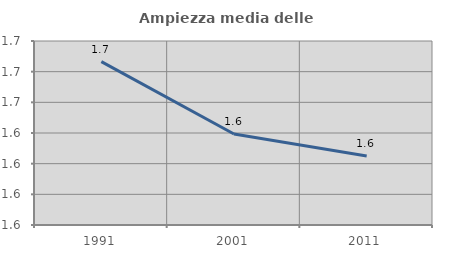
| Category | Ampiezza media delle famiglie |
|---|---|
| 1991.0 | 1.687 |
| 2001.0 | 1.639 |
| 2011.0 | 1.625 |